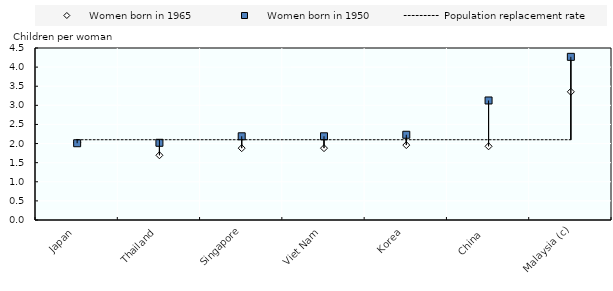
| Category | Women born in 1965 | Women born in 1950 | Population replacement rate |
|---|---|---|---|
| Japan | 2.028 | 2.009 | 2.1 |
| Thailand | 1.693 | 2.02 | 2.1 |
| Singapore | 1.88 | 2.19 | 2.1 |
| Viet Nam | 1.88 | 2.19 | 2.1 |
| Korea | 1.96 | 2.23 | 2.1 |
| China  | 1.928 | 3.127 | 2.1 |
| Malaysia (c) | 3.354 | 4.269 | 2.1 |